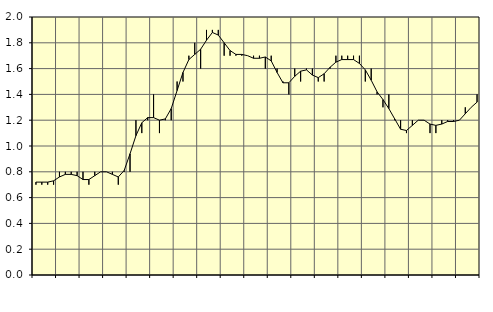
| Category | Piggar | Anställda utomlands |
|---|---|---|
| nan | 0.7 | 0.72 |
| 1.0 | 0.7 | 0.72 |
| 1.0 | 0.7 | 0.72 |
| 1.0 | 0.7 | 0.73 |
| nan | 0.8 | 0.76 |
| 2.0 | 0.8 | 0.78 |
| 2.0 | 0.8 | 0.78 |
| 2.0 | 0.8 | 0.77 |
| nan | 0.8 | 0.74 |
| 3.0 | 0.7 | 0.74 |
| 3.0 | 0.8 | 0.77 |
| 3.0 | 0.8 | 0.8 |
| nan | 0.8 | 0.8 |
| 4.0 | 0.8 | 0.78 |
| 4.0 | 0.7 | 0.76 |
| 4.0 | 0.8 | 0.81 |
| nan | 0.8 | 0.94 |
| 5.0 | 1.2 | 1.08 |
| 5.0 | 1.1 | 1.18 |
| 5.0 | 1.2 | 1.22 |
| nan | 1.4 | 1.22 |
| 6.0 | 1.1 | 1.2 |
| 6.0 | 1.2 | 1.21 |
| 6.0 | 1.2 | 1.29 |
| nan | 1.5 | 1.43 |
| 7.0 | 1.5 | 1.57 |
| 7.0 | 1.7 | 1.67 |
| 7.0 | 1.8 | 1.71 |
| nan | 1.6 | 1.75 |
| 8.0 | 1.9 | 1.82 |
| 8.0 | 1.9 | 1.88 |
| 8.0 | 1.9 | 1.86 |
| nan | 1.7 | 1.8 |
| 9.0 | 1.7 | 1.74 |
| 9.0 | 1.7 | 1.71 |
| 9.0 | 1.7 | 1.71 |
| nan | 1.7 | 1.7 |
| 10.0 | 1.7 | 1.68 |
| 10.0 | 1.7 | 1.68 |
| 10.0 | 1.6 | 1.69 |
| nan | 1.7 | 1.66 |
| 11.0 | 1.6 | 1.57 |
| 11.0 | 1.5 | 1.49 |
| 11.0 | 1.4 | 1.49 |
| nan | 1.6 | 1.54 |
| 12.0 | 1.5 | 1.58 |
| 12.0 | 1.6 | 1.59 |
| 12.0 | 1.6 | 1.55 |
| nan | 1.5 | 1.53 |
| 13.0 | 1.5 | 1.56 |
| 13.0 | 1.6 | 1.61 |
| 13.0 | 1.7 | 1.65 |
| nan | 1.7 | 1.67 |
| 14.0 | 1.7 | 1.67 |
| 14.0 | 1.7 | 1.67 |
| 14.0 | 1.7 | 1.64 |
| nan | 1.5 | 1.59 |
| 15.0 | 1.6 | 1.51 |
| 15.0 | 1.4 | 1.42 |
| 15.0 | 1.3 | 1.36 |
| nan | 1.4 | 1.29 |
| 16.0 | 1.2 | 1.21 |
| 16.0 | 1.2 | 1.13 |
| 16.0 | 1.1 | 1.12 |
| nan | 1.2 | 1.16 |
| 17.0 | 1.2 | 1.2 |
| 17.0 | 1.2 | 1.2 |
| 17.0 | 1.1 | 1.17 |
| nan | 1.1 | 1.16 |
| 18.0 | 1.2 | 1.17 |
| 18.0 | 1.2 | 1.19 |
| 18.0 | 1.2 | 1.19 |
| nan | 1.2 | 1.2 |
| 19.0 | 1.3 | 1.25 |
| 19.0 | 1.3 | 1.3 |
| 19.0 | 1.4 | 1.34 |